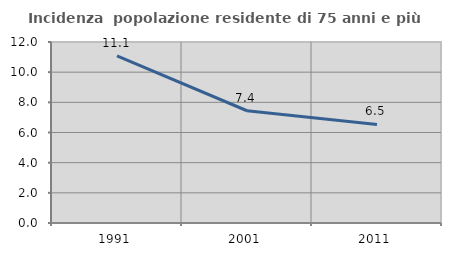
| Category | Incidenza  popolazione residente di 75 anni e più |
|---|---|
| 1991.0 | 11.08 |
| 2001.0 | 7.442 |
| 2011.0 | 6.537 |